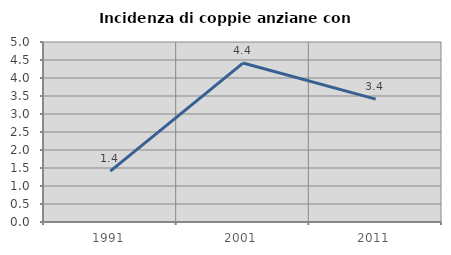
| Category | Incidenza di coppie anziane con figli |
|---|---|
| 1991.0 | 1.412 |
| 2001.0 | 4.416 |
| 2011.0 | 3.412 |